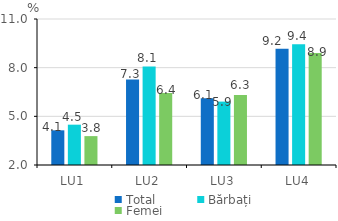
| Category | Total | Bărbați | Femei |
|---|---|---|---|
| LU1 | 4.138 | 4.486 | 3.781 |
| LU2 | 7.265 | 8.072 | 6.439 |
| LU3 | 6.107 | 5.908 | 6.308 |
| LU4 | 9.171 | 9.441 | 8.897 |